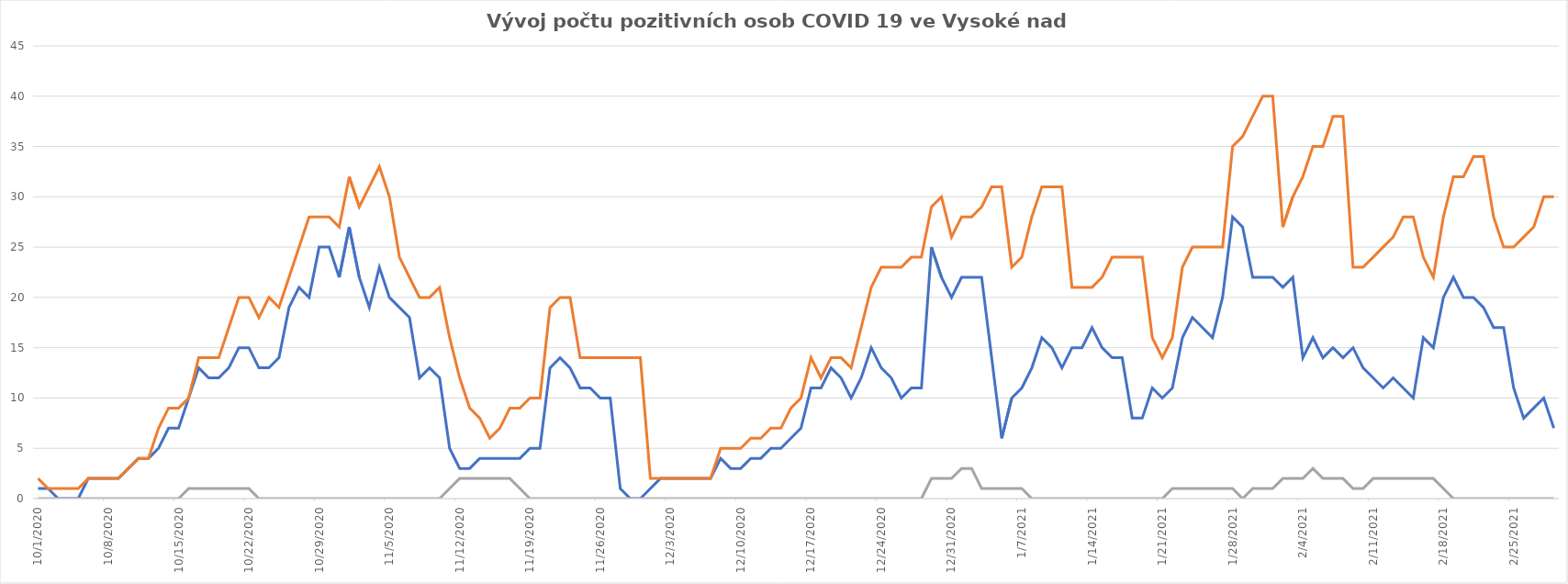
| Category | Series 0 | Series 1 | Series 2 |
|---|---|---|---|
| 10/1/20 | 1 | 2 | 0 |
| 10/2/20 | 1 | 1 | 0 |
| 10/3/20 | 0 | 1 | 0 |
| 10/4/20 | 0 | 1 | 0 |
| 10/5/20 | 0 | 1 | 0 |
| 10/6/20 | 2 | 2 | 0 |
| 10/7/20 | 2 | 2 | 0 |
| 10/8/20 | 2 | 2 | 0 |
| 10/9/20 | 2 | 2 | 0 |
| 10/10/20 | 3 | 3 | 0 |
| 10/11/20 | 4 | 4 | 0 |
| 10/12/20 | 4 | 4 | 0 |
| 10/13/20 | 5 | 7 | 0 |
| 10/14/20 | 7 | 9 | 0 |
| 10/15/20 | 7 | 9 | 0 |
| 10/16/20 | 10 | 10 | 1 |
| 10/17/20 | 13 | 14 | 1 |
| 10/18/20 | 12 | 14 | 1 |
| 10/19/20 | 12 | 14 | 1 |
| 10/20/20 | 13 | 17 | 1 |
| 10/21/20 | 15 | 20 | 1 |
| 10/22/20 | 15 | 20 | 1 |
| 10/23/20 | 13 | 18 | 0 |
| 10/24/20 | 13 | 20 | 0 |
| 10/25/20 | 14 | 19 | 0 |
| 10/26/20 | 19 | 22 | 0 |
| 10/27/20 | 21 | 25 | 0 |
| 10/28/20 | 20 | 28 | 0 |
| 10/29/20 | 25 | 28 | 0 |
| 10/30/20 | 25 | 28 | 0 |
| 10/31/20 | 22 | 27 | 0 |
| 11/1/20 | 27 | 32 | 0 |
| 11/2/20 | 22 | 29 | 0 |
| 11/3/20 | 19 | 31 | 0 |
| 11/4/20 | 23 | 33 | 0 |
| 11/5/20 | 20 | 30 | 0 |
| 11/6/20 | 19 | 24 | 0 |
| 11/7/20 | 18 | 22 | 0 |
| 11/8/20 | 12 | 20 | 0 |
| 11/9/20 | 13 | 20 | 0 |
| 11/10/20 | 12 | 21 | 0 |
| 11/11/20 | 5 | 16 | 1 |
| 11/12/20 | 3 | 12 | 2 |
| 11/13/20 | 3 | 9 | 2 |
| 11/14/20 | 4 | 8 | 2 |
| 11/15/20 | 4 | 6 | 2 |
| 11/16/20 | 4 | 7 | 2 |
| 11/17/20 | 4 | 9 | 2 |
| 11/18/20 | 4 | 9 | 1 |
| 11/19/20 | 5 | 10 | 0 |
| 11/20/20 | 5 | 10 | 0 |
| 11/21/20 | 13 | 19 | 0 |
| 11/22/20 | 14 | 20 | 0 |
| 11/23/20 | 13 | 20 | 0 |
| 11/24/20 | 11 | 14 | 0 |
| 11/25/20 | 11 | 14 | 0 |
| 11/26/20 | 10 | 14 | 0 |
| 11/27/20 | 10 | 14 | 0 |
| 11/28/20 | 1 | 14 | 0 |
| 11/29/20 | 0 | 14 | 0 |
| 11/30/20 | 0 | 14 | 0 |
| 12/1/20 | 1 | 2 | 0 |
| 12/2/20 | 2 | 2 | 0 |
| 12/3/20 | 2 | 2 | 0 |
| 12/4/20 | 2 | 2 | 0 |
| 12/5/20 | 2 | 2 | 0 |
| 12/6/20 | 2 | 2 | 0 |
| 12/7/20 | 2 | 2 | 0 |
| 12/8/20 | 4 | 5 | 0 |
| 12/9/20 | 3 | 5 | 0 |
| 12/10/20 | 3 | 5 | 0 |
| 12/11/20 | 4 | 6 | 0 |
| 12/12/20 | 4 | 6 | 0 |
| 12/13/20 | 5 | 7 | 0 |
| 12/14/20 | 5 | 7 | 0 |
| 12/15/20 | 6 | 9 | 0 |
| 12/16/20 | 7 | 10 | 0 |
| 12/17/20 | 11 | 14 | 0 |
| 12/18/20 | 11 | 12 | 0 |
| 12/19/20 | 13 | 14 | 0 |
| 12/20/20 | 12 | 14 | 0 |
| 12/21/20 | 10 | 13 | 0 |
| 12/22/20 | 12 | 17 | 0 |
| 12/23/20 | 15 | 21 | 0 |
| 12/24/20 | 13 | 23 | 0 |
| 12/25/20 | 12 | 23 | 0 |
| 12/26/20 | 10 | 23 | 0 |
| 12/27/20 | 11 | 24 | 0 |
| 12/28/20 | 11 | 24 | 0 |
| 12/29/20 | 25 | 29 | 2 |
| 12/30/20 | 22 | 30 | 2 |
| 12/31/20 | 20 | 26 | 2 |
| 1/1/21 | 22 | 28 | 3 |
| 1/2/21 | 22 | 28 | 3 |
| 1/3/21 | 22 | 29 | 1 |
| 1/4/21 | 14 | 31 | 1 |
| 1/5/21 | 6 | 31 | 1 |
| 1/6/21 | 10 | 23 | 1 |
| 1/7/21 | 11 | 24 | 1 |
| 1/8/21 | 13 | 28 | 0 |
| 1/9/21 | 16 | 31 | 0 |
| 1/10/21 | 15 | 31 | 0 |
| 1/11/21 | 13 | 31 | 0 |
| 1/12/21 | 15 | 21 | 0 |
| 1/13/21 | 15 | 21 | 0 |
| 1/14/21 | 17 | 21 | 0 |
| 1/15/21 | 15 | 22 | 0 |
| 1/16/21 | 14 | 24 | 0 |
| 1/17/21 | 14 | 24 | 0 |
| 1/18/21 | 8 | 24 | 0 |
| 1/19/21 | 8 | 24 | 0 |
| 1/20/21 | 11 | 16 | 0 |
| 1/21/21 | 10 | 14 | 0 |
| 1/22/21 | 11 | 16 | 1 |
| 1/23/21 | 16 | 23 | 1 |
| 1/24/21 | 18 | 25 | 1 |
| 1/25/21 | 17 | 25 | 1 |
| 1/26/21 | 16 | 25 | 1 |
| 1/27/21 | 20 | 25 | 1 |
| 1/28/21 | 28 | 35 | 1 |
| 1/29/21 | 27 | 36 | 0 |
| 1/30/21 | 22 | 38 | 1 |
| 1/31/21 | 22 | 40 | 1 |
| 2/1/21 | 22 | 40 | 1 |
| 2/2/21 | 21 | 27 | 2 |
| 2/3/21 | 22 | 30 | 2 |
| 2/4/21 | 14 | 32 | 2 |
| 2/5/21 | 16 | 35 | 3 |
| 2/6/21 | 14 | 35 | 2 |
| 2/7/21 | 15 | 38 | 2 |
| 2/8/21 | 14 | 38 | 2 |
| 2/9/21 | 15 | 23 | 1 |
| 2/10/21 | 13 | 23 | 1 |
| 2/11/21 | 12 | 24 | 2 |
| 2/12/21 | 11 | 25 | 2 |
| 2/13/21 | 12 | 26 | 2 |
| 2/14/21 | 11 | 28 | 2 |
| 2/15/21 | 10 | 28 | 2 |
| 2/16/21 | 16 | 24 | 2 |
| 2/17/21 | 15 | 22 | 2 |
| 2/18/21 | 20 | 28 | 1 |
| 2/19/21 | 22 | 32 | 0 |
| 2/20/21 | 20 | 32 | 0 |
| 2/21/21 | 20 | 34 | 0 |
| 2/22/21 | 19 | 34 | 0 |
| 2/23/21 | 17 | 28 | 0 |
| 2/24/21 | 17 | 25 | 0 |
| 2/25/21 | 11 | 25 | 0 |
| 2/26/21 | 8 | 26 | 0 |
| 2/27/21 | 9 | 27 | 0 |
| 2/28/21 | 10 | 30 | 0 |
| 3/1/21 | 7 | 30 | 0 |